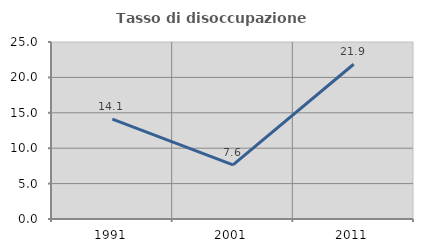
| Category | Tasso di disoccupazione giovanile  |
|---|---|
| 1991.0 | 14.118 |
| 2001.0 | 7.634 |
| 2011.0 | 21.86 |